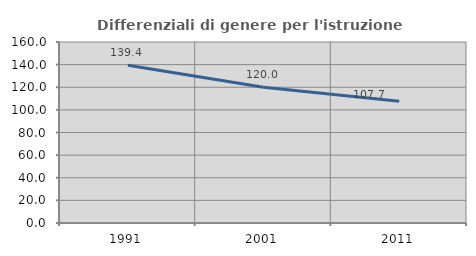
| Category | Differenziali di genere per l'istruzione superiore |
|---|---|
| 1991.0 | 139.401 |
| 2001.0 | 120.03 |
| 2011.0 | 107.68 |